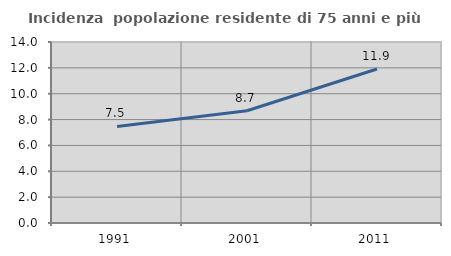
| Category | Incidenza  popolazione residente di 75 anni e più |
|---|---|
| 1991.0 | 7.465 |
| 2001.0 | 8.68 |
| 2011.0 | 11.912 |